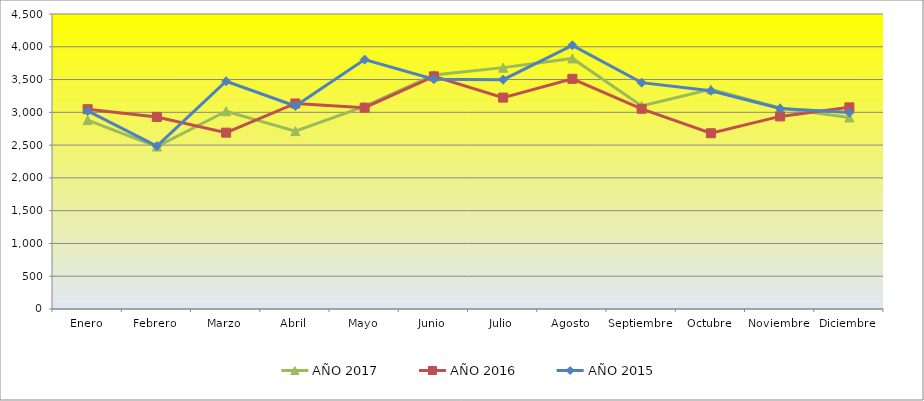
| Category | AÑO 2017 | AÑO 2016 | AÑO 2015 |
|---|---|---|---|
| Enero | 2881.159 | 3048 | 3021 |
| Febrero | 2478.068 | 2930 | 2485 |
| Marzo | 3016.425 | 2690 | 3474 |
| Abril | 2713.43 | 3135 | 3097 |
| Mayo | 3089.469 | 3071 | 3804 |
| Junio | 3568.309 | 3549 | 3506 |
| Julio | 3681.932 | 3225 | 3498 |
| Agosto | 3822.609 | 3511 | 4022 |
| Septiembre | 3097.585 | 3054 | 3453 |
| Octubre | 3352.075 | 2681 | 3328 |
| Noviembre | 3066.792 | 2938 | 3058 |
| Diciembre | 2921.739 | 3076 | 2996 |